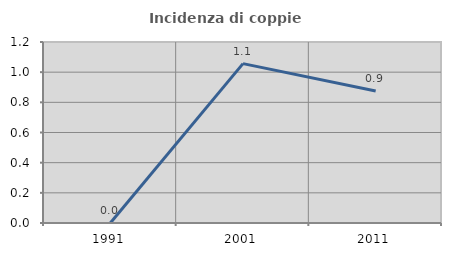
| Category | Incidenza di coppie miste |
|---|---|
| 1991.0 | 0 |
| 2001.0 | 1.057 |
| 2011.0 | 0.875 |